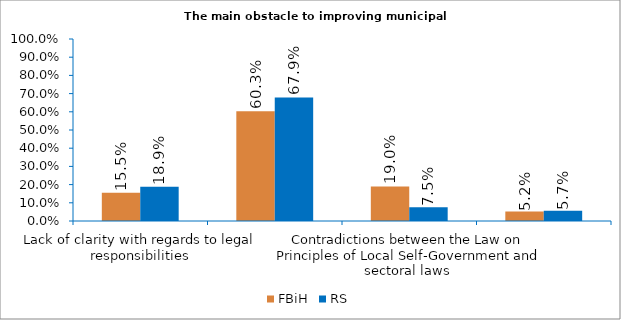
| Category | FBiH | RS |
|---|---|---|
| Lack of clarity with regards to legal responsibilities | 0.155 | 0.189 |
| Insufficient funding for legally assigned competencies | 0.603 | 0.679 |
| Contradictions between the Law on Principles of Local Self-Government and sectoral laws  | 0.19 | 0.075 |
| Obstacles to cooperation with other government units  | 0.052 | 0.057 |